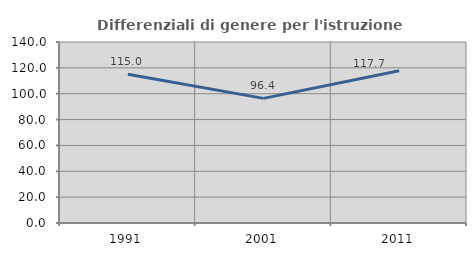
| Category | Differenziali di genere per l'istruzione superiore |
|---|---|
| 1991.0 | 114.984 |
| 2001.0 | 96.395 |
| 2011.0 | 117.716 |